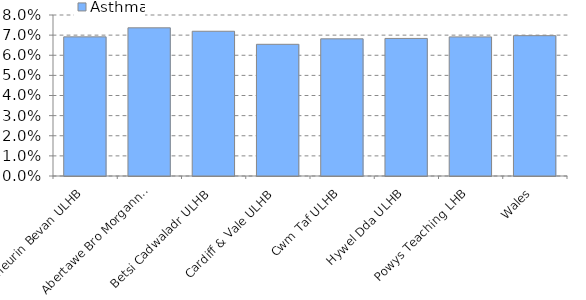
| Category | Asthma |
|---|---|
| Aneurin Bevan ULHB | 0.069 |
| Abertawe Bro Morgannwg ULHB | 0.074 |
| Betsi Cadwaladr ULHB | 0.072 |
| Cardiff & Vale ULHB | 0.065 |
| Cwm Taf ULHB | 0.068 |
| Hywel Dda ULHB | 0.068 |
| Powys Teaching LHB | 0.069 |
| Wales | 0.07 |